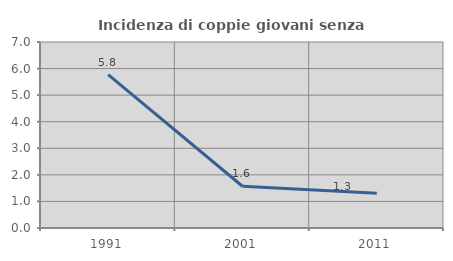
| Category | Incidenza di coppie giovani senza figli |
|---|---|
| 1991.0 | 5.769 |
| 2001.0 | 1.572 |
| 2011.0 | 1.311 |